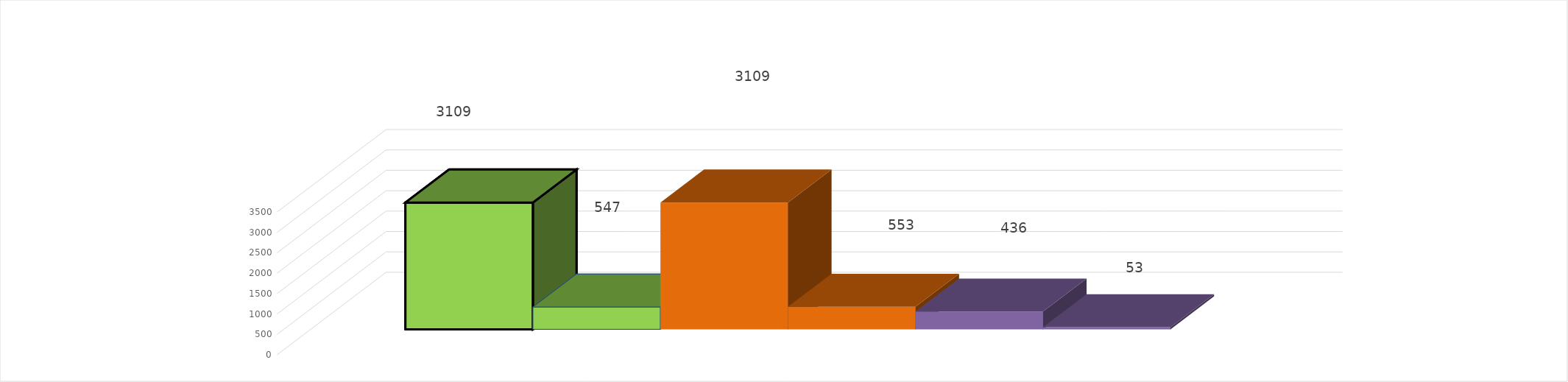
| Category | 2 квартал 2019 год | 2 квартал 2020 год |
|---|---|---|
| 0 | 436 | 53 |